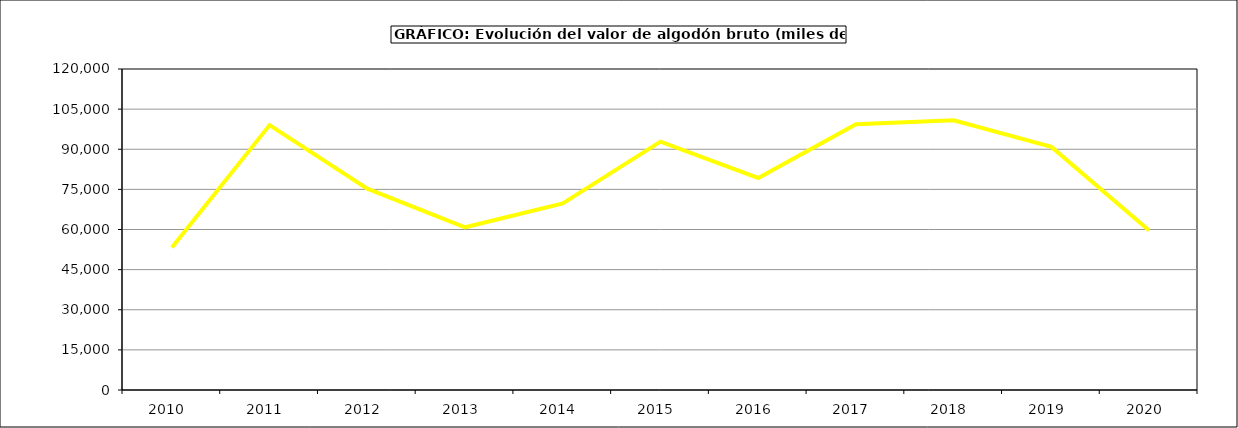
| Category | Valor |
|---|---|
| 2010.0 | 53297.253 |
| 2011.0 | 99030.746 |
| 2012.0 | 75288.36 |
| 2013.0 | 60816.95 |
| 2014.0 | 69735 |
| 2015.0 | 92834 |
| 2016.0 | 79254 |
| 2017.0 | 99372.773 |
| 2018.0 | 100830.014 |
| 2019.0 | 90873.491 |
| 2020.0 | 59662.854 |